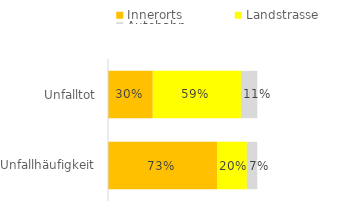
| Category | Innerorts | Landstrasse | Autobahn |
|---|---|---|---|
| Unfallhäufigkeit | 0.73 | 0.2 | 0.07 |
| Unfalltot | 0.3 | 0.59 | 0.11 |